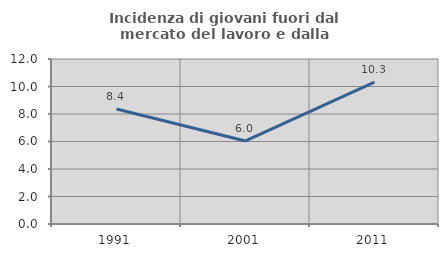
| Category | Incidenza di giovani fuori dal mercato del lavoro e dalla formazione  |
|---|---|
| 1991.0 | 8.367 |
| 2001.0 | 6.041 |
| 2011.0 | 10.319 |